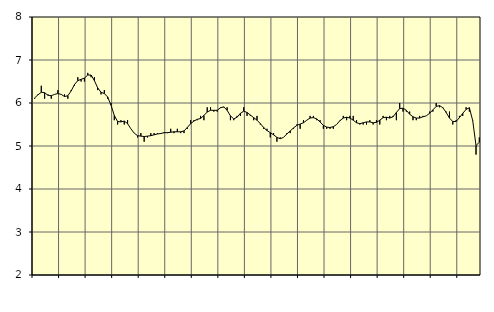
| Category | Piggar | Transport, SNI 49-53 |
|---|---|---|
| nan | 6.1 | 6.12 |
| 87.0 | 6.2 | 6.19 |
| 87.0 | 6.4 | 6.25 |
| 87.0 | 6.1 | 6.24 |
| nan | 6.2 | 6.18 |
| 88.0 | 6.1 | 6.17 |
| 88.0 | 6.2 | 6.2 |
| 88.0 | 6.3 | 6.22 |
| nan | 6.2 | 6.2 |
| 89.0 | 6.2 | 6.15 |
| 89.0 | 6.1 | 6.17 |
| 89.0 | 6.3 | 6.28 |
| nan | 6.4 | 6.43 |
| 90.0 | 6.6 | 6.52 |
| 90.0 | 6.5 | 6.55 |
| 90.0 | 6.5 | 6.58 |
| nan | 6.7 | 6.65 |
| 91.0 | 6.6 | 6.65 |
| 91.0 | 6.6 | 6.52 |
| 91.0 | 6.3 | 6.35 |
| nan | 6.2 | 6.25 |
| 92.0 | 6.3 | 6.22 |
| 92.0 | 6.1 | 6.14 |
| 92.0 | 6 | 5.95 |
| nan | 5.6 | 5.71 |
| 93.0 | 5.5 | 5.57 |
| 93.0 | 5.6 | 5.56 |
| 93.0 | 5.5 | 5.58 |
| nan | 5.6 | 5.52 |
| 94.0 | 5.4 | 5.4 |
| 94.0 | 5.3 | 5.3 |
| 94.0 | 5.2 | 5.24 |
| nan | 5.3 | 5.23 |
| 95.0 | 5.1 | 5.22 |
| 95.0 | 5.2 | 5.23 |
| 95.0 | 5.3 | 5.24 |
| nan | 5.3 | 5.26 |
| 96.0 | 5.3 | 5.28 |
| 96.0 | 5.3 | 5.29 |
| 96.0 | 5.3 | 5.31 |
| nan | 5.3 | 5.31 |
| 97.0 | 5.4 | 5.32 |
| 97.0 | 5.3 | 5.33 |
| 97.0 | 5.4 | 5.33 |
| nan | 5.3 | 5.33 |
| 98.0 | 5.3 | 5.35 |
| 98.0 | 5.4 | 5.43 |
| 98.0 | 5.6 | 5.52 |
| nan | 5.6 | 5.58 |
| 99.0 | 5.6 | 5.62 |
| 99.0 | 5.7 | 5.64 |
| 99.0 | 5.6 | 5.71 |
| nan | 5.9 | 5.79 |
| 0.0 | 5.9 | 5.83 |
| 0.0 | 5.8 | 5.83 |
| 0.0 | 5.8 | 5.83 |
| nan | 5.9 | 5.89 |
| 1.0 | 5.9 | 5.91 |
| 1.0 | 5.9 | 5.83 |
| 1.0 | 5.6 | 5.7 |
| nan | 5.6 | 5.63 |
| 2.0 | 5.7 | 5.67 |
| 2.0 | 5.7 | 5.76 |
| 2.0 | 5.9 | 5.81 |
| nan | 5.7 | 5.78 |
| 3.0 | 5.7 | 5.72 |
| 3.0 | 5.6 | 5.66 |
| 3.0 | 5.7 | 5.6 |
| nan | 5.5 | 5.52 |
| 4.0 | 5.4 | 5.43 |
| 4.0 | 5.4 | 5.36 |
| 4.0 | 5.2 | 5.31 |
| nan | 5.3 | 5.26 |
| 5.0 | 5.1 | 5.2 |
| 5.0 | 5.2 | 5.17 |
| 5.0 | 5.2 | 5.2 |
| nan | 5.3 | 5.28 |
| 6.0 | 5.3 | 5.35 |
| 6.0 | 5.4 | 5.42 |
| 6.0 | 5.5 | 5.48 |
| nan | 5.4 | 5.51 |
| 7.0 | 5.6 | 5.54 |
| 7.0 | 5.6 | 5.6 |
| 7.0 | 5.7 | 5.65 |
| nan | 5.7 | 5.66 |
| 8.0 | 5.6 | 5.63 |
| 8.0 | 5.6 | 5.56 |
| 8.0 | 5.4 | 5.48 |
| nan | 5.4 | 5.44 |
| 9.0 | 5.4 | 5.43 |
| 9.0 | 5.4 | 5.45 |
| 9.0 | 5.5 | 5.5 |
| nan | 5.6 | 5.59 |
| 10.0 | 5.7 | 5.65 |
| 10.0 | 5.6 | 5.67 |
| 10.0 | 5.7 | 5.65 |
| nan | 5.7 | 5.6 |
| 11.0 | 5.6 | 5.54 |
| 11.0 | 5.5 | 5.52 |
| 11.0 | 5.5 | 5.54 |
| nan | 5.5 | 5.56 |
| 12.0 | 5.6 | 5.56 |
| 12.0 | 5.5 | 5.54 |
| 12.0 | 5.6 | 5.55 |
| nan | 5.5 | 5.6 |
| 13.0 | 5.7 | 5.66 |
| 13.0 | 5.6 | 5.67 |
| 13.0 | 5.7 | 5.65 |
| nan | 5.7 | 5.68 |
| 14.0 | 5.6 | 5.78 |
| 14.0 | 6 | 5.87 |
| 14.0 | 5.8 | 5.88 |
| nan | 5.8 | 5.83 |
| 15.0 | 5.8 | 5.74 |
| 15.0 | 5.6 | 5.68 |
| 15.0 | 5.6 | 5.65 |
| nan | 5.7 | 5.65 |
| 16.0 | 5.7 | 5.68 |
| 16.0 | 5.7 | 5.7 |
| 16.0 | 5.8 | 5.76 |
| nan | 5.8 | 5.84 |
| 17.0 | 6 | 5.92 |
| 17.0 | 5.9 | 5.94 |
| 17.0 | 5.9 | 5.89 |
| nan | 5.8 | 5.78 |
| 18.0 | 5.8 | 5.65 |
| 18.0 | 5.5 | 5.57 |
| 18.0 | 5.6 | 5.57 |
| nan | 5.7 | 5.66 |
| 19.0 | 5.7 | 5.76 |
| 19.0 | 5.9 | 5.85 |
| 19.0 | 5.8 | 5.89 |
| nan | 5.6 | 5.59 |
| 20.0 | 4.8 | 5.01 |
| 20.0 | 5.2 | 5.09 |